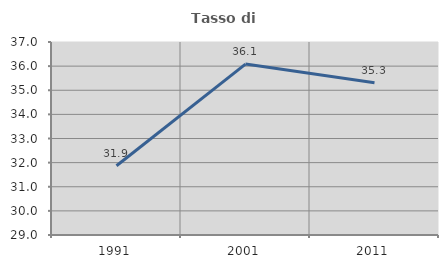
| Category | Tasso di occupazione   |
|---|---|
| 1991.0 | 31.869 |
| 2001.0 | 36.085 |
| 2011.0 | 35.313 |